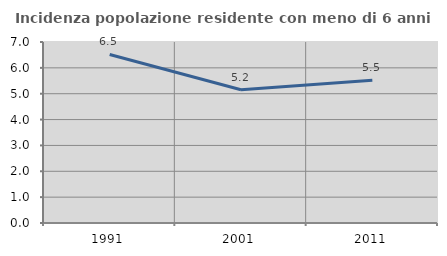
| Category | Incidenza popolazione residente con meno di 6 anni |
|---|---|
| 1991.0 | 6.519 |
| 2001.0 | 5.155 |
| 2011.0 | 5.523 |